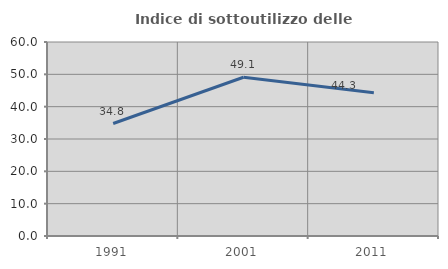
| Category | Indice di sottoutilizzo delle abitazioni  |
|---|---|
| 1991.0 | 34.783 |
| 2001.0 | 49.108 |
| 2011.0 | 44.311 |